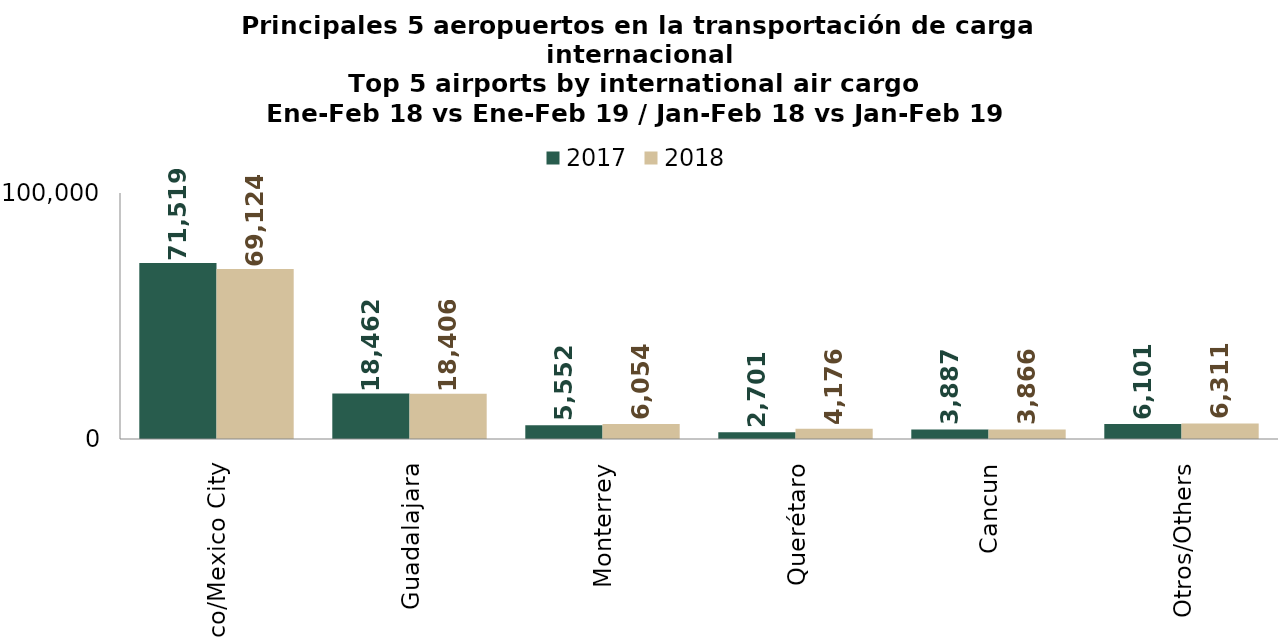
| Category | 2017 | 2018 |
|---|---|---|
| Ciudad De México/Mexico City | 71519.41 | 69124.38 |
| Guadalajara | 18461.59 | 18406.393 |
| Monterrey | 5551.844 | 6053.767 |
| Querétaro | 2701.267 | 4176.022 |
| Cancun | 3887.445 | 3866.3 |
| Otros/Others | 6100.791 | 6311.335 |